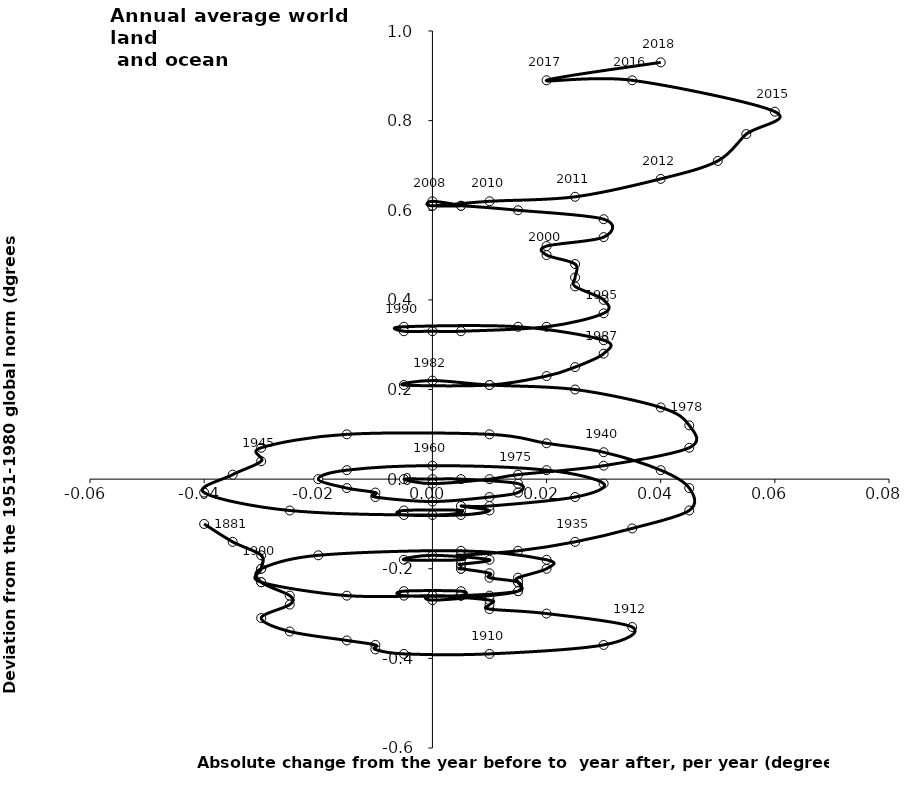
| Category | Series 0 |
|---|---|
| -0.04000000000000001 | -0.1 |
| -0.035 | -0.14 |
| -0.03 | -0.17 |
| -0.03 | -0.2 |
| -0.03 | -0.23 |
| -0.015 | -0.26 |
| 0.0 | -0.26 |
| 0.0 | -0.26 |
| 0.0050000000000000044 | -0.26 |
| 0.0050000000000000044 | -0.25 |
| -0.0050000000000000044 | -0.25 |
| -0.0050000000000000044 | -0.26 |
| 0.0050000000000000044 | -0.26 |
| 0.015 | -0.25 |
| 0.015 | -0.23 |
| 0.015 | -0.22 |
| 0.020000000000000004 | -0.2 |
| 0.020000000000000004 | -0.18 |
| 0.0049999999999999906 | -0.16 |
| -0.020000000000000004 | -0.17 |
| -0.03 | -0.2 |
| -0.03 | -0.23 |
| -0.02500000000000001 | -0.26 |
| -0.024999999999999994 | -0.28 |
| -0.03 | -0.31 |
| -0.024999999999999994 | -0.34 |
| -0.014999999999999986 | -0.36 |
| -0.010000000000000009 | -0.37 |
| -0.010000000000000009 | -0.38 |
| -0.0050000000000000044 | -0.39 |
| 0.010000000000000009 | -0.39 |
| 0.03 | -0.37 |
| 0.035 | -0.33 |
| 0.020000000000000018 | -0.3 |
| 0.009999999999999981 | -0.29 |
| 0.009999999999999981 | -0.28 |
| 0.010000000000000009 | -0.27 |
| 0.0 | -0.26 |
| 0.0 | -0.27 |
| 0.010000000000000009 | -0.26 |
| 0.015 | -0.25 |
| 0.015 | -0.23 |
| 0.010000000000000009 | -0.22 |
| 0.009999999999999995 | -0.21 |
| 0.0049999999999999906 | -0.2 |
| 0.0050000000000000044 | -0.2 |
| 0.0050000000000000044 | -0.19 |
| 0.0050000000000000044 | -0.19 |
| 0.009999999999999995 | -0.18 |
| 0.0 | -0.17 |
| -0.0049999999999999906 | -0.18 |
| 0.0049999999999999906 | -0.18 |
| 0.0049999999999999906 | -0.17 |
| 0.0050000000000000044 | -0.17 |
| 0.015 | -0.16 |
| 0.025 | -0.14 |
| 0.035 | -0.11 |
| 0.045 | -0.07 |
| 0.045000000000000005 | -0.02 |
| 0.04 | 0.02 |
| 0.03 | 0.06 |
| 0.020000000000000004 | 0.08 |
| 0.010000000000000002 | 0.1 |
| -0.015 | 0.1 |
| -0.030000000000000002 | 0.07 |
| -0.030000000000000002 | 0.04 |
| -0.035 | 0.01 |
| -0.04 | -0.03 |
| -0.025 | -0.07 |
| 0.0 | -0.08 |
| 0.0049999999999999975 | -0.07 |
| -0.0049999999999999975 | -0.07 |
| -0.0049999999999999975 | -0.08 |
| 0.0049999999999999975 | -0.08 |
| 0.010000000000000002 | -0.07 |
| 0.0050000000000000044 | -0.06 |
| 0.009999999999999998 | -0.06 |
| 0.024999999999999998 | -0.04 |
| 0.03 | -0.01 |
| 0.02 | 0.02 |
| 0.0 | 0.03 |
| -0.015 | 0.02 |
| -0.02 | 0 |
| -0.015 | -0.02 |
| -0.01 | -0.03 |
| -0.010000000000000002 | -0.04 |
| 0.0 | -0.05 |
| 0.010000000000000002 | -0.04 |
| 0.015 | -0.03 |
| 0.015 | -0.01 |
| 0.005 | 0 |
| 0.0 | 0 |
| -0.005 | 0 |
| 0.0 | -0.01 |
| 0.01 | 0 |
| 0.015 | 0.01 |
| 0.030000000000000002 | 0.03 |
| 0.045 | 0.07 |
| 0.045 | 0.12 |
| 0.04000000000000001 | 0.16 |
| 0.024999999999999994 | 0.2 |
| 0.009999999999999995 | 0.21 |
| 0.0 | 0.22 |
| -0.0050000000000000044 | 0.21 |
| 0.010000000000000009 | 0.21 |
| 0.020000000000000004 | 0.23 |
| 0.02500000000000001 | 0.25 |
| 0.03 | 0.28 |
| 0.03 | 0.31 |
| 0.015000000000000013 | 0.34 |
| -0.0050000000000000044 | 0.34 |
| -0.0050000000000000044 | 0.33 |
| 0.0 | 0.33 |
| 0.0050000000000000044 | 0.33 |
| 0.01999999999999999 | 0.34 |
| 0.03 | 0.37 |
| 0.03 | 0.4 |
| 0.024999999999999994 | 0.43 |
| 0.024999999999999994 | 0.45 |
| 0.024999999999999994 | 0.48 |
| 0.020000000000000018 | 0.5 |
| 0.020000000000000018 | 0.52 |
| 0.02999999999999997 | 0.54 |
| 0.02999999999999997 | 0.58 |
| 0.015000000000000013 | 0.6 |
| 0.0050000000000000044 | 0.61 |
| 0.0 | 0.61 |
| 0.0050000000000000044 | 0.61 |
| 0.0 | 0.62 |
| 0.0 | 0.61 |
| 0.010000000000000009 | 0.62 |
| 0.025000000000000022 | 0.63 |
| 0.03999999999999998 | 0.67 |
| 0.04999999999999999 | 0.71 |
| 0.05499999999999999 | 0.77 |
| 0.06 | 0.82 |
| 0.03500000000000003 | 0.89 |
| 0.020000000000000018 | 0.89 |
| 0.040000000000000036 | 0.93 |